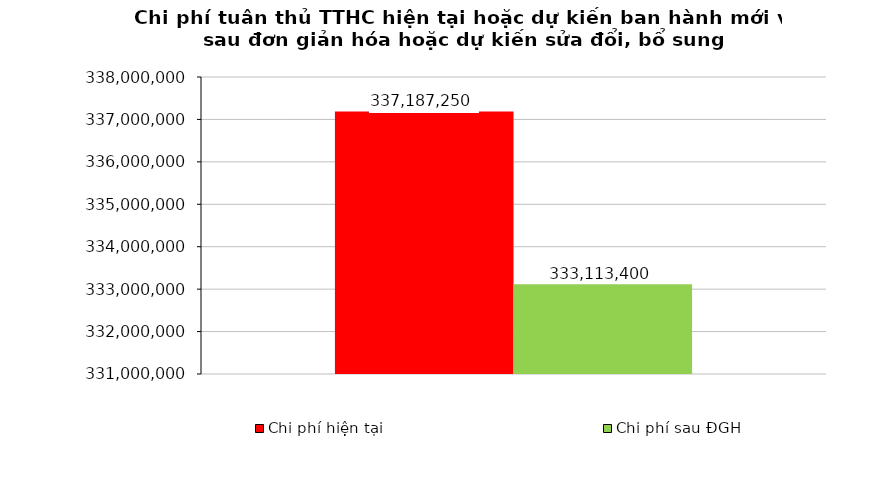
| Category | Chi phí hiện tại | Chi phí sau ĐGH |
|---|---|---|
| 0 | 337187250 | 333113400 |